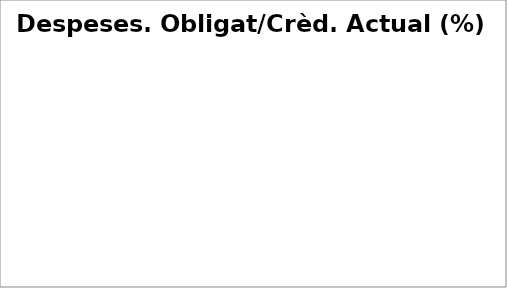
| Category | Series 0 |
|---|---|
| Despeses de personal | 0.07 |
| Despeses en béns corrents i serveis | 0 |
| Despeses financeres | 0.03 |
| Transferències corrents | 0.023 |
| Fons de contingència | 0 |
| Inversions reals | 0.1 |
| Transferències de capital | 0 |
| Actius financers | 0 |
| Passius financers | 0.008 |